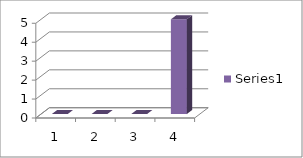
| Category | Series 0 |
|---|---|
| 0 | 0 |
| 1 | 0 |
| 2 | 0 |
| 3 | 5 |